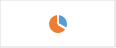
| Category | Section 2.C : Collaboration intra et intersectorielle, information et communication interne |
|---|---|
| 0 | 0.333 |
| 1 | 0.667 |